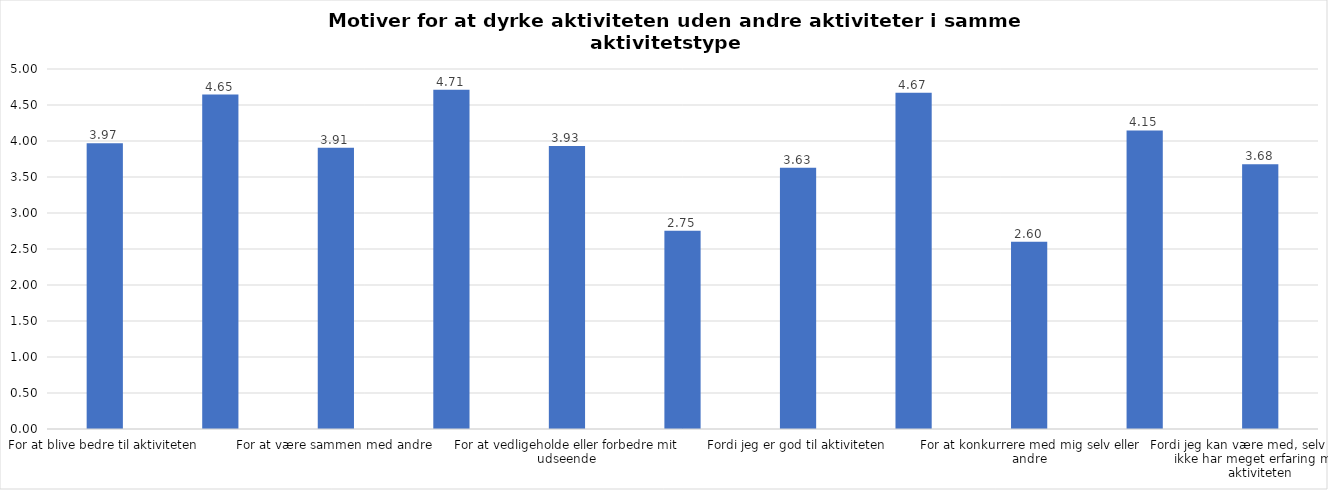
| Category | Gennemsnit |
|---|---|
| For at blive bedre til aktiviteten | 3.97 |
| For at vedligeholde eller forbedre min sundhed (fx helbred, fysisk form) | 4.646 |
| For at være sammen med andre | 3.907 |
| For at gøre noget godt for mig selv | 4.712 |
| For at vedligeholde eller forbedre mit udseende | 3.931 |
| Fordi andre i min omgangskreds opmuntrer mig til det | 2.753 |
| Fordi jeg er god til aktiviteten | 3.627 |
| Fordi jeg godt kan lide aktiviteten | 4.67 |
| For at konkurrere med mig selv eller andre | 2.599 |
| Fordi aktiviteten passer godt ind i min hverdag | 4.146 |
| Fordi jeg kan være med, selv om jeg ikke har meget erfaring med aktiviteten | 3.677 |